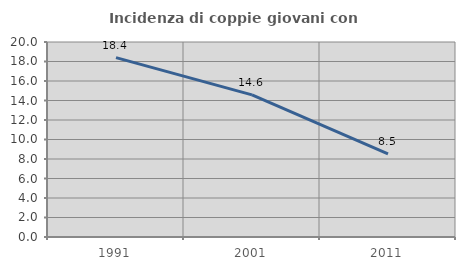
| Category | Incidenza di coppie giovani con figli |
|---|---|
| 1991.0 | 18.399 |
| 2001.0 | 14.579 |
| 2011.0 | 8.536 |